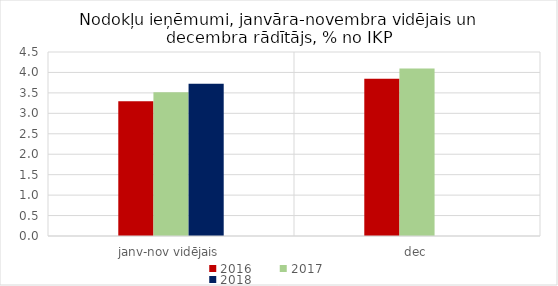
| Category | 2016 | 2017 | 2018 |
|---|---|---|---|
| janv-nov vidējais | 3.293 | 3.514 | 3.721 |
| dec | 3.846 | 4.096 | 0 |